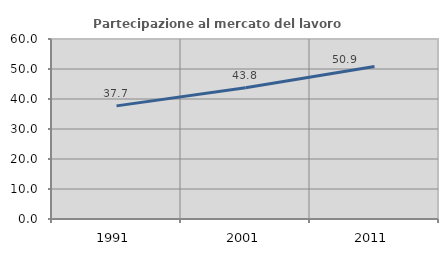
| Category | Partecipazione al mercato del lavoro  femminile |
|---|---|
| 1991.0 | 37.712 |
| 2001.0 | 43.75 |
| 2011.0 | 50.862 |